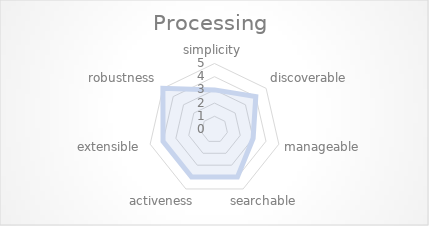
| Category | Processing |
|---|---|
| simplicity | 3 |
| discoverable | 4 |
| manageable | 3 |
| searchable | 4 |
| activeness | 4 |
| extensible | 4 |
| robustness | 5 |